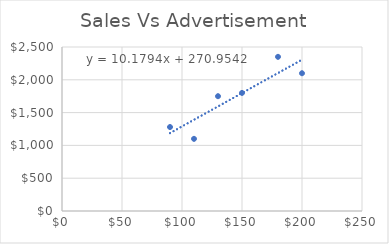
| Category | Series 0 |
|---|---|
| 200.0 | 2100 |
| 110.0 | 1100 |
| 90.0 | 1280 |
| 150.0 | 1800 |
| 130.0 | 1750 |
| 180.0 | 2350 |